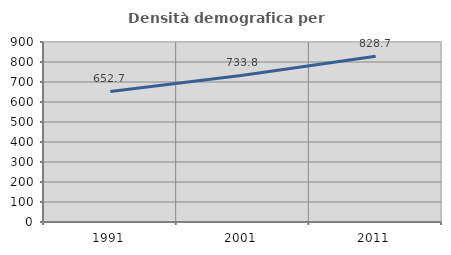
| Category | Densità demografica |
|---|---|
| 1991.0 | 652.743 |
| 2001.0 | 733.794 |
| 2011.0 | 828.738 |